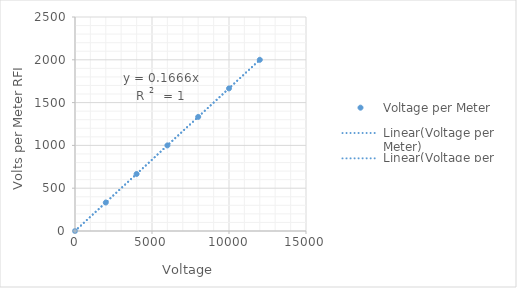
| Category | Voltage per Meter |
|---|---|
| 0.0 | 0 |
| 2000.0 | 333 |
| 4000.0 | 666 |
| 6000.0 | 1000 |
| 8000.0 | 1333 |
| 10000.0 | 1666 |
| 12000.0 | 2000 |